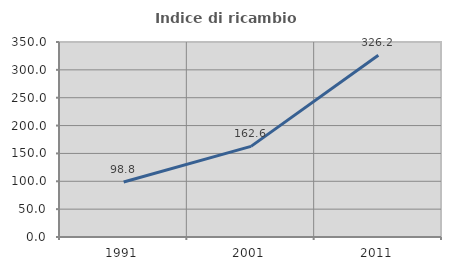
| Category | Indice di ricambio occupazionale  |
|---|---|
| 1991.0 | 98.782 |
| 2001.0 | 162.608 |
| 2011.0 | 326.194 |